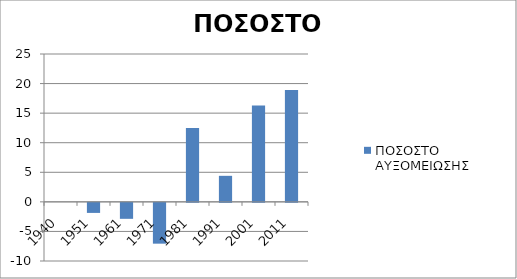
| Category | ΠΟΣΟΣΤΟ ΑΥΞΟΜΕΙΩΣΗΣ |
|---|---|
| 1940.0 | 0 |
| 1951.0 | -1.7 |
| 1961.0 | -2.7 |
| 1971.0 | -6.9 |
| 1981.0 | 12.5 |
| 1991.0 | 4.4 |
| 2001.0 | 16.3 |
| 2011.0 | 18.9 |